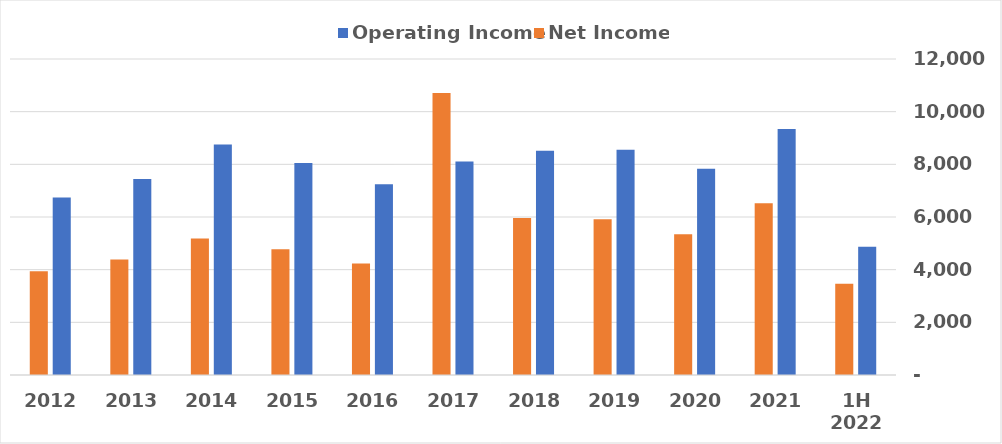
| Category | Operating Income | Net Income |
|---|---|---|
| 1H 2022 | 4872 | 3465 |
| 2021 | 9338 | 6523 |
| 2020 | 7834 | 5349 |
| 2019 | 8554 | 5919 |
| 2018 | 8517 | 5966 |
| 2017 | 8106 | 10712 |
| 2016 | 7243 | 4233 |
| 2015 | 8052 | 4772 |
| 2014 | 8753 | 5180 |
| 2013 | 7446 | 4388 |
| 2012 | 6745 | 3943 |